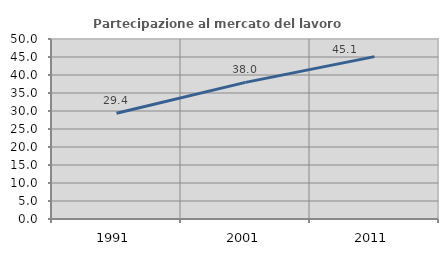
| Category | Partecipazione al mercato del lavoro  femminile |
|---|---|
| 1991.0 | 29.371 |
| 2001.0 | 37.957 |
| 2011.0 | 45.101 |